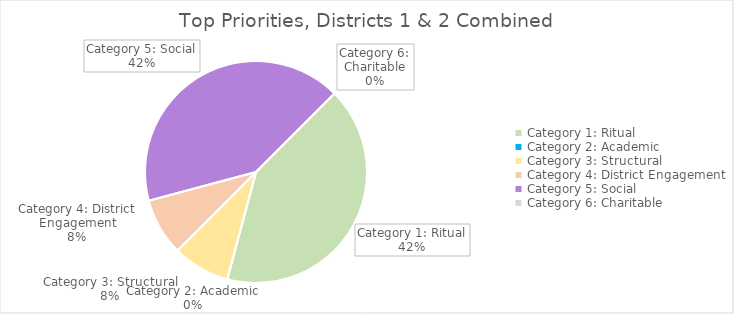
| Category | Combined |
|---|---|
| Category 1: Ritual | 5 |
| Category 2: Academic | 0 |
| Category 3: Structural | 1 |
| Category 4: District Engagement | 1 |
| Category 5: Social | 5 |
| Category 6: Charitable | 0 |